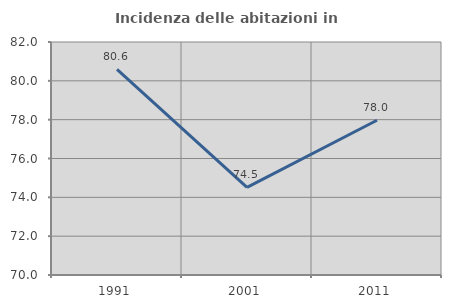
| Category | Incidenza delle abitazioni in proprietà  |
|---|---|
| 1991.0 | 80.591 |
| 2001.0 | 74.517 |
| 2011.0 | 77.972 |